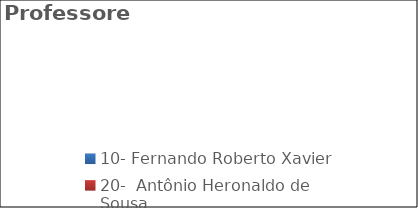
| Category | Professores |
|---|---|
| 10- Fernando Roberto Xavier  | 0 |
| 20-  Antônio Heronaldo de Sousa | 0 |